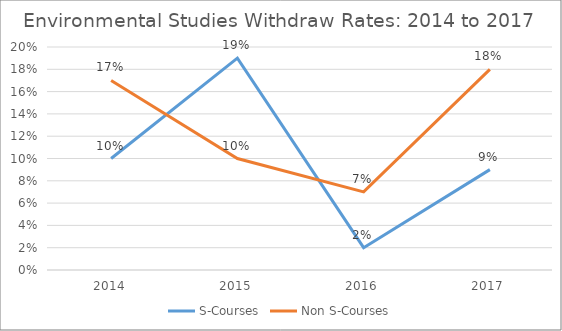
| Category | S-Courses | Non S-Courses |
|---|---|---|
| 2014.0 | 0.1 | 0.17 |
| 2015.0 | 0.19 | 0.1 |
| 2016.0 | 0.02 | 0.07 |
| 2017.0 | 0.09 | 0.18 |